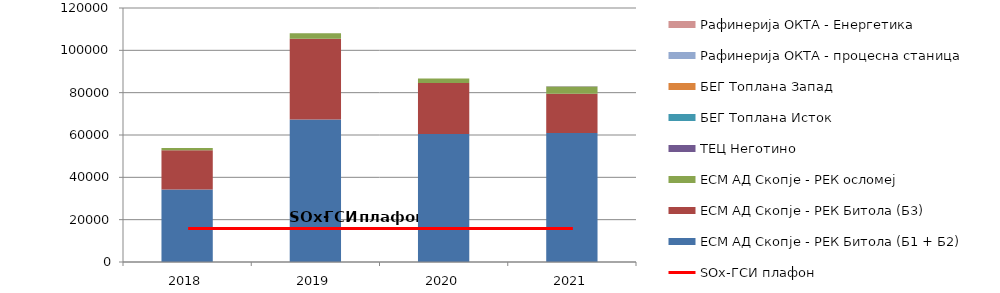
| Category | EСМ AД Скопје - РЕК Битола (Б1 + Б2) | EСМ AД Скопје - РЕК Битола (Б3) | EСМ AД Скопје - РЕК осломеј | ТЕЦ Неготино | БЕГ Топлана Исток | БЕГ Топлана Запад | Рафинерија ОКТА - процесна станица | Рафинерија ОКТА - Енергетика |
|---|---|---|---|---|---|---|---|---|
| 2018.0 | 34234 | 18589 | 1031 | 0 | 0 | 0 | 0 | 0 |
| 2019.0 | 67300 | 38131 | 2601 | 0 | 0 | 0 | 0 | 0 |
| 2020.0 | 60442 | 24091 | 2167 | 0 | 0 | 0 | 0 | 0 |
| 2021.0 | 60925 | 18581 | 3378 | 175 | 0 | 0 | 0 | 0 |